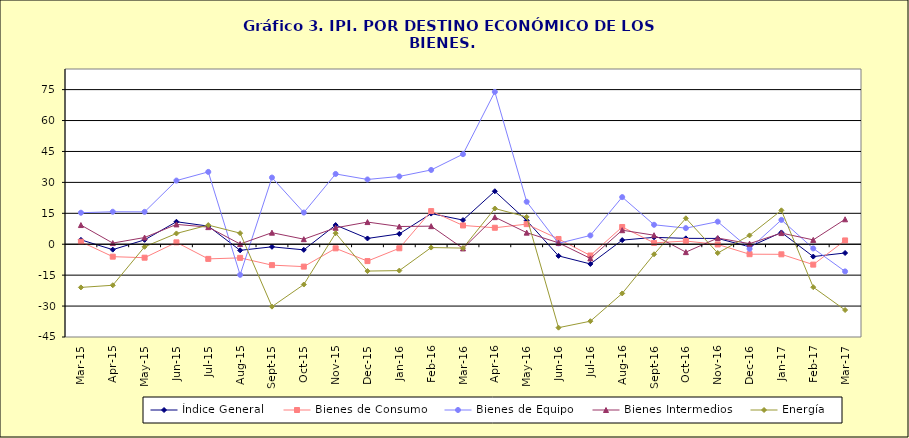
| Category | Índice General | Bienes de Consumo | Bienes de Equipo | Bienes Intermedios | Energía |
|---|---|---|---|---|---|
| 2015-03-03 | 2.131 | 1.203 | 15.281 | 9.3 | -20.948 |
| 2015-04-04 | -2.63 | -6.03 | 15.752 | 0.561 | -19.901 |
| 2015-05-05 | 2.125 | -6.529 | 15.704 | 3.256 | -1.239 |
| 2015-06-06 | 10.902 | 0.91 | 30.872 | 9.621 | 5.228 |
| 2015-07-07 | 8.793 | -7.107 | 35.085 | 8.305 | 9.286 |
| 2015-08-08 | -2.962 | -6.613 | -14.841 | 0.112 | 5.376 |
| 2015-09-09 | -1.256 | -10.141 | 32.343 | 5.602 | -30.267 |
| 2015-10-10 | -2.727 | -10.858 | 15.36 | 2.447 | -19.543 |
| 2015-11-01 | 9.284 | -1.991 | 34.093 | 7.964 | 5.354 |
| 2015-12-02 | 2.805 | -8.175 | 31.408 | 10.746 | -13.016 |
| 2016-01-01 | 5.027 | -1.96 | 32.892 | 8.608 | -12.792 |
| 2016-02-02 | 14.862 | 16.078 | 36.032 | 8.761 | -1.615 |
| 2016-03-03 | 11.716 | 9.106 | 43.694 | -2.035 | -1.868 |
| 2016-04-04 | 25.706 | 7.991 | 73.903 | 13.136 | 17.325 |
| 2016-05-05 | 11.507 | 9.748 | 20.6 | 5.623 | 13.239 |
| 2016-06-06 | -5.65 | 2.55 | 0.417 | 0.684 | -40.48 |
| 2016-07-07 | -9.559 | -5.474 | 4.264 | -6.863 | -37.333 |
| 2016-08-08 | 1.995 | 8.358 | 22.861 | 6.807 | -23.865 |
| 2016-09-09 | 3.335 | 0.656 | 9.44 | 4.376 | -4.862 |
| 2016-10-10 | 2.852 | 1.546 | 7.819 | -3.836 | 12.574 |
| 2016-11-11 | 2.812 | -0.098 | 10.95 | 3.005 | -4.261 |
| 2016-12-12 | -1.223 | -4.833 | -2.218 | 0.285 | 4.279 |
| 2017-01-01 | 5.716 | -4.897 | 11.796 | 5.41 | 16.442 |
| 2017-02-02 | -5.985 | -9.891 | -2.038 | 2.111 | -20.833 |
| 2017-03-03 | -4.253 | 1.842 | -13.19 | 12.099 | -31.912 |